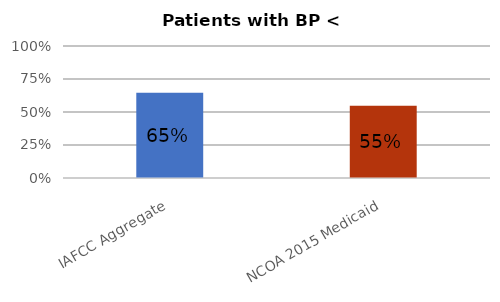
| Category | Series 0 |
|---|---|
| IAFCC Aggregate | 0.645 |
| NCOA 2015 Medicaid | 0.547 |